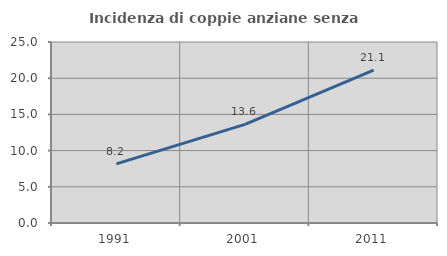
| Category | Incidenza di coppie anziane senza figli  |
|---|---|
| 1991.0 | 8.163 |
| 2001.0 | 13.615 |
| 2011.0 | 21.116 |